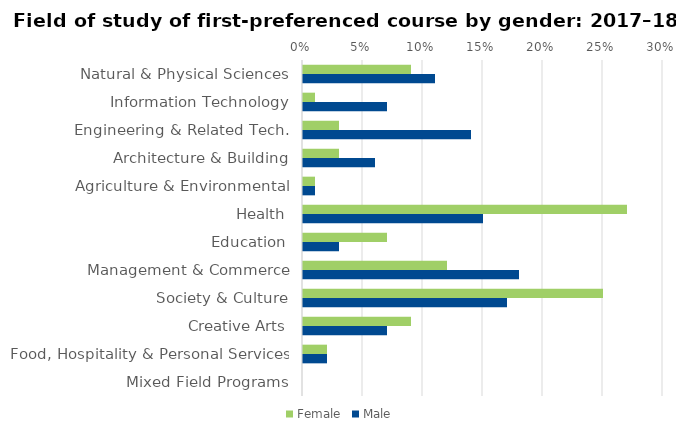
| Category | Female | Male |
|---|---|---|
| Natural & Physical Sciences | 0.09 | 0.11 |
| Information Technology | 0.01 | 0.07 |
| Engineering & Related Tech. | 0.03 | 0.14 |
| Architecture & Building | 0.03 | 0.06 |
| Agriculture & Environmental | 0.01 | 0.01 |
| Health | 0.27 | 0.15 |
| Education | 0.07 | 0.03 |
| Management & Commerce | 0.12 | 0.18 |
| Society & Culture | 0.25 | 0.17 |
| Creative Arts | 0.09 | 0.07 |
| Food, Hospitality & Personal Services | 0.02 | 0.02 |
| Mixed Field Programs | 0 | 0 |